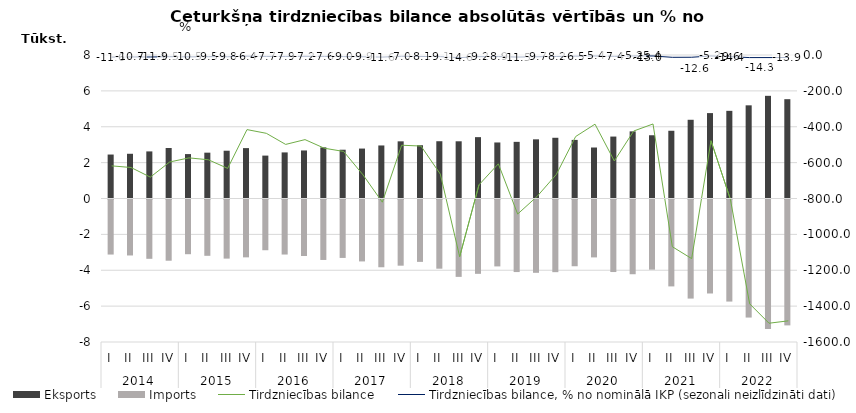
| Category | Eksports | Imports |
|---|---|---|
| 0 | 2450.7 | -3068.8 |
| 1 | 2493.4 | -3120.5 |
| 2 | 2625.5 | -3306.5 |
| 3 | 2816.7 | -3413.2 |
| 4 | 2476.5 | -3050.1 |
| 5 | 2555.2 | -3139.2 |
| 6 | 2663.4 | -3295.5 |
| 7 | 2809.5 | -3225.4 |
| 8 | 2391.5 | -2828.1 |
| 9 | 2569.5 | -3068 |
| 10 | 2678.2 | -3149.9 |
| 11 | 2850.8 | -3370.5 |
| 12 | 2719.6 | -3257.4 |
| 13 | 2783.8 | -3452 |
| 14 | 2956.9 | -3777.4 |
| 15 | 3187 | -3690 |
| 16 | 2969.9 | -3477.4 |
| 17 | 3193.3 | -3857.4 |
| 18 | 3189.7 | -4313.9 |
| 19 | 3420.5 | -4144.2 |
| 20 | 3123.6 | -3730.2 |
| 21 | 3158.2 | -4044.8 |
| 22 | 3298.5 | -4087.5 |
| 23 | 3385.3 | -4051.1 |
| 24 | 3266.4 | -3720.9 |
| 25 | 2842.7 | -3228.3 |
| 26 | 3452.8 | -4043.7 |
| 27 | 3742.7 | -4166.6 |
| 28 | 3526.2 | -3910.7 |
| 29 | 3776 | -4844.9 |
| 30 | 4388.7 | -5523.8 |
| 31 | 4761.5 | -5239.5 |
| 32 | 4886.7 | -5690.3 |
| 33 | 5194.3 | -6581.5 |
| 34 | 5724 | -7219.3 |
| 35 | 5536.4 | -7018.4 |